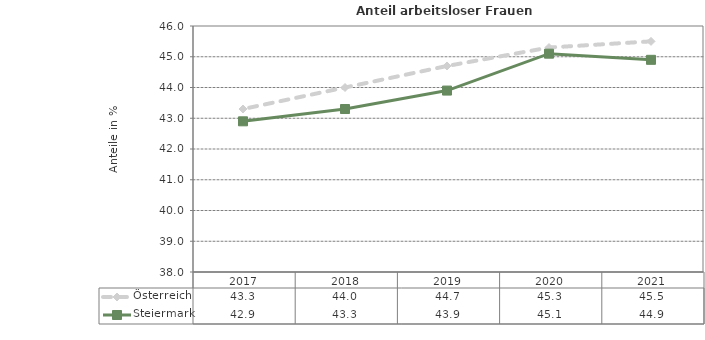
| Category | Österreich | Steiermark |
|---|---|---|
| 2021.0 | 45.5 | 44.9 |
| 2020.0 | 45.3 | 45.1 |
| 2019.0 | 44.7 | 43.9 |
| 2018.0 | 44 | 43.3 |
| 2017.0 | 43.3 | 42.9 |